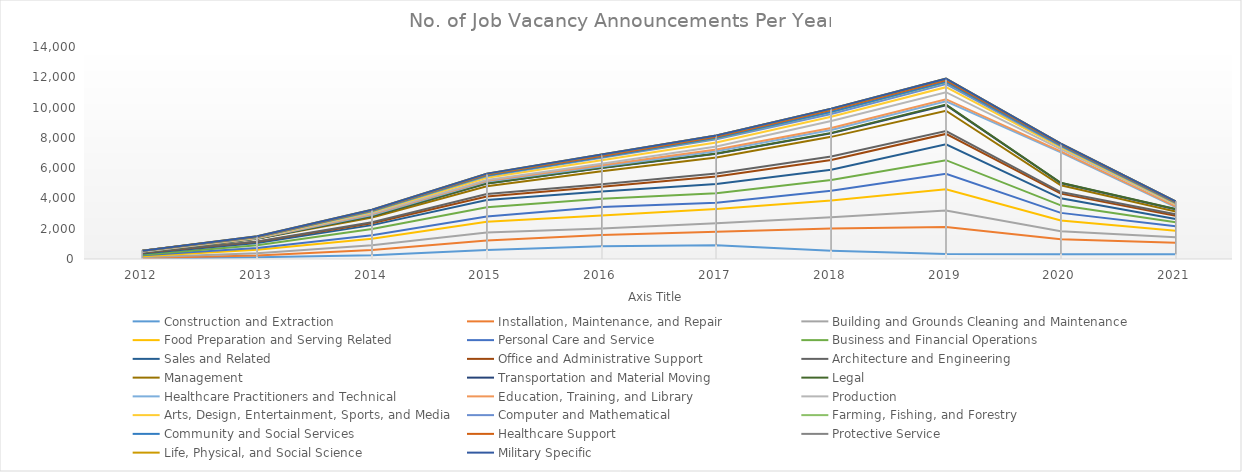
| Category | Construction and Extraction | Installation, Maintenance, and Repair | Building and Grounds Cleaning and Maintenance | Food Preparation and Serving Related | Personal Care and Service | Business and Financial Operations | Sales and Related | Office and Administrative Support | Architecture and Engineering | Management | Transportation and Material Moving | Legal | Healthcare Practitioners and Technical | Education, Training, and Library | Production | Arts, Design, Entertainment, Sports, and Media | Computer and Mathematical | Farming, Fishing, and Forestry | Community and Social Services | Healthcare Support | Protective Service | Life, Physical, and Social Science | Military Specific  |
|---|---|---|---|---|---|---|---|---|---|---|---|---|---|---|---|---|---|---|---|---|---|---|---|
| 2012.0 | 24 | 43 | 51 | 62 | 60 | 41 | 75 | 50 | 15 | 45 | 11 | 1 | 8 | 3 | 12 | 25 | 6 | 8 | 1 | 3 | 3 | 2 | 0 |
| 2013.0 | 118 | 113 | 152 | 230 | 112 | 188 | 142 | 82 | 20 | 185 | 10 | 2 | 17 | 10 | 14 | 32 | 18 | 13 | 1 | 5 | 20 | 12 | 0 |
| 2014.0 | 253 | 348 | 304 | 436 | 229 | 417 | 249 | 128 | 68 | 304 | 94 | 4 | 78 | 59 | 56 | 80 | 40 | 24 | 11 | 29 | 28 | 12 | 0 |
| 2015.0 | 598 | 631 | 528 | 702 | 352 | 601 | 489 | 231 | 158 | 518 | 174 | 11 | 121 | 50 | 48 | 157 | 105 | 42 | 4 | 57 | 45 | 13 | 3 |
| 2016.0 | 849 | 740 | 428 | 857 | 558 | 549 | 481 | 304 | 178 | 857 | 202 | 18 | 95 | 82 | 91 | 236 | 153 | 51 | 13 | 59 | 87 | 16 | 0 |
| 2017.0 | 915 | 887 | 559 | 936 | 416 | 633 | 609 | 492 | 202 | 1057 | 239 | 24 | 145 | 112 | 202 | 268 | 219 | 63 | 27 | 59 | 86 | 9 | 2 |
| 2018.0 | 546 | 1467 | 737 | 1114 | 646 | 701 | 684 | 637 | 242 | 1292 | 231 | 33 | 184 | 135 | 468 | 272 | 186 | 134 | 20 | 115 | 69 | 17 | 0 |
| 2019.0 | 337 | 1769 | 1093 | 1403 | 1024 | 900 | 1050 | 684 | 191 | 1339 | 367 | 39 | 215 | 141 | 463 | 332 | 208 | 121 | 24 | 100 | 93 | 15 | 0 |
| 2020.0 | 319 | 980 | 530 | 709 | 508 | 497 | 463 | 310 | 102 | 451 | 148 | 16 | 2014 | 58 | 156 | 113 | 75 | 48 | 15 | 59 | 41 | 7 | 0 |
| 2021.0 | 315 | 752 | 366 | 431 | 293 | 266 | 212 | 222 | 99 | 187 | 147 | 7 | 123 | 50 | 116 | 55 | 46 | 33 | 9 | 36 | 33 | 2 | 0 |